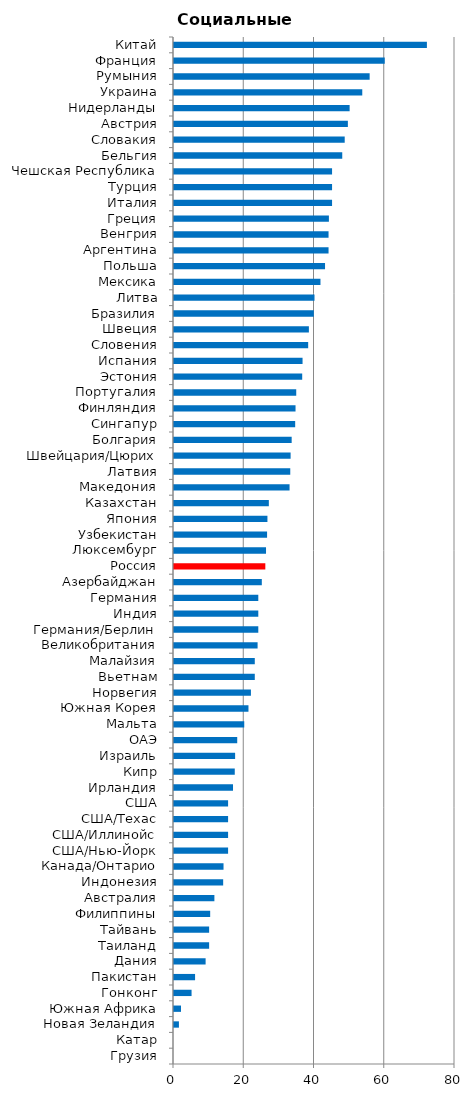
| Category | Социальные налоги |
|---|---|
| Грузия | 0 |
| Катар | 0 |
| Новая Зеландия | 1.4 |
| Южная Африка | 2 |
| Гонконг | 5 |
| Пакистан | 6 |
| Дания | 9 |
| Таиланд | 10 |
| Тайвань | 10 |
| Филиппины | 10.3 |
| Австралия | 11.5 |
| Индонезия | 14 |
| Канада/Онтарио | 14.1 |
| США/Нью-Йорк | 15.4 |
| США/Иллинойс | 15.4 |
| США/Техас | 15.4 |
| США | 15.4 |
| Ирландия | 16.8 |
| Кипр | 17.3 |
| Израиль | 17.4 |
| ОАЭ | 18 |
| Мальта | 20 |
| Южная Корея | 21.2 |
| Норвегия | 21.9 |
| Вьетнам | 23 |
| Малайзия | 23 |
| Великобритания | 23.8 |
| Германия/Берлин | 24 |
| Индия | 24 |
| Германия | 24 |
| Азербайджан | 25 |
| Россия | 26 |
| Люксембург | 26.2 |
| Узбекистан | 26.5 |
| Япония | 26.6 |
| Казахстан | 27 |
| Македония | 32.9 |
| Латвия | 33.1 |
| Швейцария/Цюрих | 33.2 |
| Болгария | 33.5 |
| Сингапур | 34.5 |
| Финляндия | 34.6 |
| Португалия | 34.8 |
| Эстония | 36.5 |
| Испания | 36.6 |
| Словения | 38.2 |
| Швеция | 38.4 |
| Бразилия | 39.8 |
| Литва | 40 |
| Мексика | 41.7 |
| Польша | 43 |
| Аргентина | 44 |
| Венгрия | 44 |
| Греция | 44.1 |
| Италия | 45 |
| Турция | 45 |
| Чешская Республика | 45 |
| Бельгия | 47.9 |
| Словакия | 48.6 |
| Австрия | 49.5 |
| Нидерланды | 50 |
| Украина | 53.6 |
| Румыния | 55.7 |
| Франция | 60 |
| Китай | 72 |